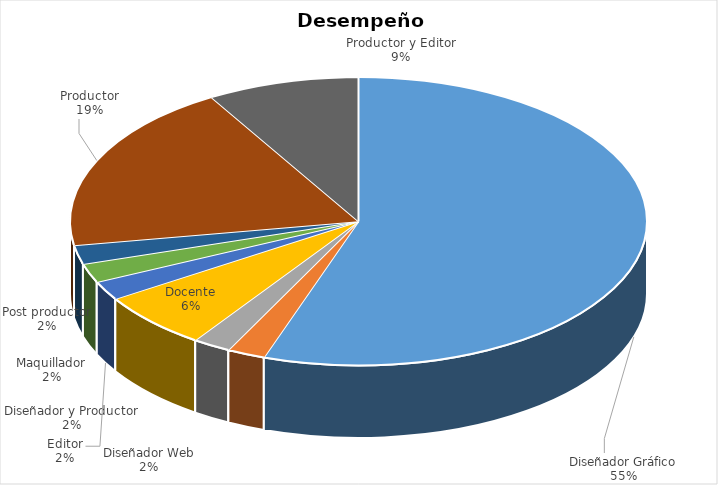
| Category | Total |
|---|---|
| Diseñador Gráfico | 26 |
| Diseñador Web | 1 |
| Diseñador y Productor | 1 |
| Docente | 3 |
| Editor | 1 |
| Maquillador | 1 |
| Post productor | 1 |
| Productor | 9 |
| Productor y Editor | 4 |